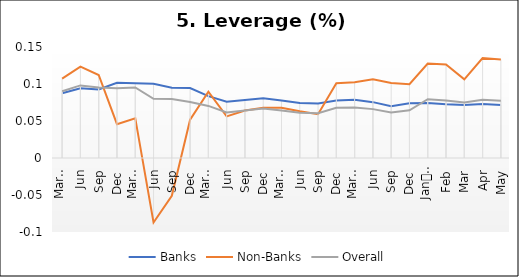
| Category | Banks | Non-Banks | Overall |
|---|---|---|---|
| 0 | 0.088 | 0.107 | 0.09 |
| 1 | 0.094 | 0.123 | 0.098 |
| 2 | 0.093 | 0.112 | 0.095 |
| 3 | 0.102 | 0.046 | 0.094 |
| 4 | 0.101 | 0.054 | 0.095 |
| 5 | 0.1 | -0.087 | 0.08 |
| 6 | 0.095 | -0.051 | 0.08 |
| 7 | 0.095 | 0.052 | 0.076 |
| 8 | 0.084 | 0.09 | 0.07 |
| 9 | 0.076 | 0.056 | 0.062 |
| 10 | 0.079 | 0.064 | 0.064 |
| 11 | 0.081 | 0.068 | 0.067 |
| 12 | 0.078 | 0.068 | 0.064 |
| 13 | 0.074 | 0.063 | 0.061 |
| 14 | 0.074 | 0.059 | 0.061 |
| 15 | 0.078 | 0.101 | 0.068 |
| 16 | 0.079 | 0.102 | 0.068 |
| 17 | 0.075 | 0.106 | 0.066 |
| 18 | 0.07 | 0.102 | 0.061 |
| 19 | 0.074 | 0.1 | 0.064 |
| 20 | 0.074 | 0.128 | 0.079 |
| 21 | 0.073 | 0.126 | 0.078 |
| 22 | 0.072 | 0.106 | 0.075 |
| 23 | 0.073 | 0.135 | 0.079 |
| 24 | 0.072 | 0.133 | 0.077 |